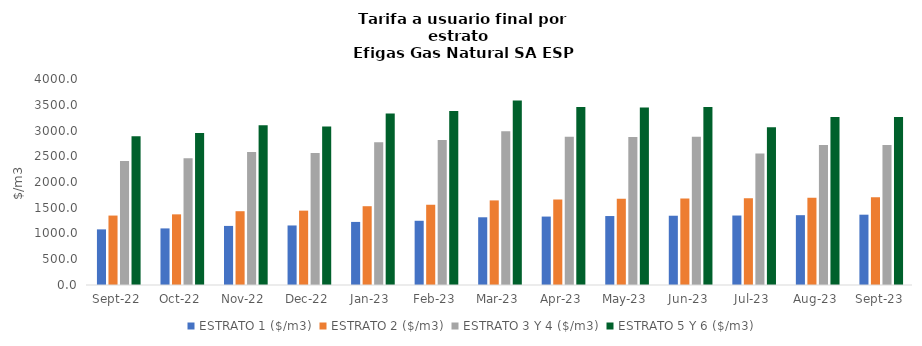
| Category | ESTRATO 1 ($/m3) | ESTRATO 2 ($/m3) | ESTRATO 3 Y 4 ($/m3) | ESTRATO 5 Y 6 ($/m3) |
|---|---|---|---|---|
| 2022-09-01 | 1080.05 | 1348.32 | 2407 | 2888.4 |
| 2022-10-01 | 1098.89 | 1371.9 | 2459.68 | 2951.616 |
| 2022-11-01 | 1147.2 | 1432.78 | 2584.83 | 3101.796 |
| 2022-12-01 | 1156.03 | 1443.8 | 2563.93 | 3076.716 |
| 2023-01-01 | 1224.77 | 1529.93 | 2774 | 3328.8 |
| 2023-02-01 | 1247.16 | 1558.32 | 2816 | 3379.2 |
| 2023-03-01 | 1314.94 | 1642.54 | 2985.304 | 3582.364 |
| 2023-04-01 | 1328.75 | 1659.79 | 2880.614 | 3456.737 |
| 2023-05-01 | 1339.14 | 1672.77 | 2874.12 | 3448.944 |
| 2023-06-01 | 1344.99 | 1680.07 | 2880.614 | 3456.737 |
| 2023-07-01 | 1349.02 | 1685.11 | 2551.788 | 3062.145 |
| 2023-08-01 | 1355.78 | 1693.55 | 2720.369 | 3264.443 |
| 2023-09-01 | 1365.26 | 1705.39 | 2717.396 | 3260.875 |